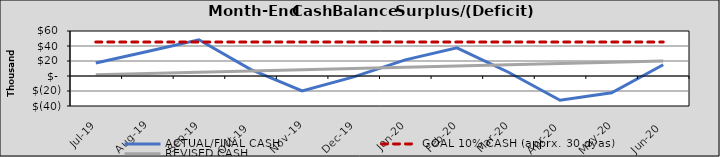
| Category | ACTUAL/FINAL CASH | GOAL 10% CASH (apprx. 30 dyas) | REVISED CASH |
|---|---|---|---|
| 2019-07-01 | 17427.801 | 45290.526 | 1669.173 |
| 2019-08-01 | 32601.672 | 45290.526 | 3338.347 |
| 2019-09-01 | 48347.722 | 45290.526 | 5007.52 |
| 2019-10-02 | 8913.523 | 45290.526 | 6676.693 |
| 2019-11-02 | -19778.676 | 45290.526 | 8345.867 |
| 2019-12-03 | -1230.875 | 45290.526 | 10015.04 |
| 2020-01-03 | 21515.176 | 45290.526 | 11684.213 |
| 2020-02-03 | 37511.226 | 45290.526 | 13353.387 |
| 2020-03-05 | 5011.027 | 45290.526 | 15022.56 |
| 2020-04-05 | -32281.172 | 45290.526 | 16691.733 |
| 2020-05-06 | -22273.371 | 45290.526 | 18360.907 |
| 2020-06-06 | 15025.297 | 45290.526 | 20030.08 |